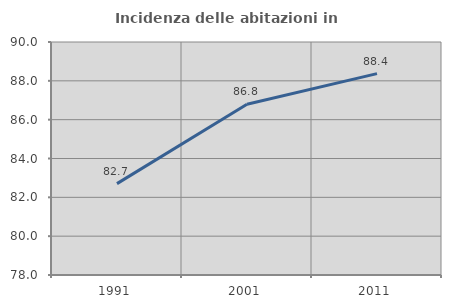
| Category | Incidenza delle abitazioni in proprietà  |
|---|---|
| 1991.0 | 82.707 |
| 2001.0 | 86.798 |
| 2011.0 | 88.372 |